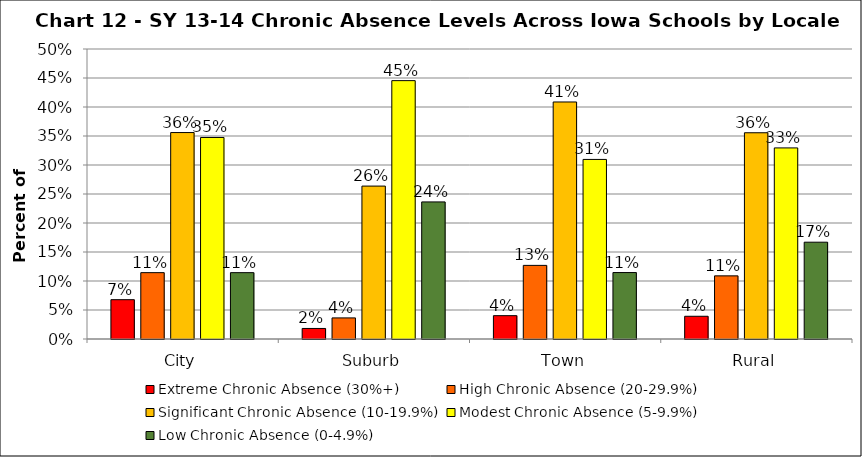
| Category | Extreme Chronic Absence (30%+) | High Chronic Absence (20-29.9%) | Significant Chronic Absence (10-19.9%) | Modest Chronic Absence (5-9.9%) | Low Chronic Absence (0-4.9%) |
|---|---|---|---|---|---|
| 0 | 0.068 | 0.114 | 0.356 | 0.347 | 0.114 |
| 1 | 0.018 | 0.036 | 0.264 | 0.445 | 0.236 |
| 2 | 0.04 | 0.127 | 0.409 | 0.31 | 0.115 |
| 3 | 0.039 | 0.109 | 0.356 | 0.329 | 0.167 |